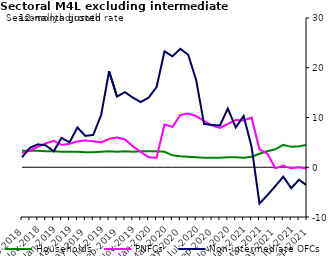
| Category | zero | Households | PNFCs | Non-intermediate OFCs |
|---|---|---|---|---|
| Sep-2018 | 0 | 3.3 | 2.9 | 2 |
| Oct-2018 | 0 | 3.3 | 3.3 | 3.9 |
| Nov-2018 | 0 | 3.3 | 4.1 | 4.6 |
| Dec-2018 | 0 | 3.2 | 4.8 | 4.4 |
| Jan-2019 | 0 | 3.2 | 5.3 | 3.2 |
| Feb-2019 | 0 | 3.1 | 4.5 | 5.9 |
| Mar-2019 | 0 | 3.1 | 4.7 | 5 |
| Apr-2019 | 0 | 3.1 | 5.2 | 8 |
| May-2019 | 0 | 3 | 5.4 | 6.3 |
| Jun-2019 | 0 | 3 | 5.2 | 6.5 |
| Jul-2019 | 0 | 3.1 | 5 | 10.5 |
| Aug-2019 | 0 | 3.2 | 5.7 | 19.3 |
| Sep-2019 | 0 | 3.1 | 6 | 14.2 |
| Oct-2019 | 0 | 3.2 | 5.6 | 15.1 |
| Nov-2019 | 0 | 3.1 | 4.2 | 14 |
| Dec-2019 | 0 | 3.2 | 3.1 | 13.1 |
| Jan-2020 | 0 | 3.2 | 2 | 14 |
| Feb-2020 | 0 | 3.2 | 1.9 | 16.1 |
| Mar-2020 | 0 | 3.1 | 8.6 | 23.3 |
| Apr-2020 | 0 | 2.4 | 8.1 | 22.3 |
| May-2020 | 0 | 2.2 | 10.5 | 23.8 |
| Jun-2020 | 0 | 2.1 | 10.8 | 22.6 |
| Jul-2020 | 0 | 2 | 10.3 | 17.5 |
| Aug-2020 | 0 | 1.9 | 9.3 | 8.7 |
| Sep-2020 | 0 | 1.9 | 8.4 | 8.5 |
| Oct-2020 | 0 | 1.9 | 7.9 | 8.4 |
| Nov-2020 | 0 | 2 | 8.7 | 11.8 |
| Dec-2020 | 0 | 2 | 9.5 | 8 |
| Jan-2021 | 0 | 1.9 | 9.4 | 10.3 |
| Feb-2021 | 0 | 2.1 | 10 | 4.1 |
| Mar-2021 | 0 | 2.7 | 3.6 | -7.3 |
| Apr-2021 | 0 | 3.2 | 2.7 | -5.6 |
| May-2021 | 0 | 3.6 | -0.2 | -3.8 |
| Jun-2021 | 0 | 4.5 | 0.3 | -1.9 |
| Jul-2021 | 0 | 4.1 | -0.2 | -4.2 |
| Aug-2021 | 0 | 4.2 | 0 | -2.5 |
| Sep-2021 | 0 | 4.5 | -0.3 | -3.7 |